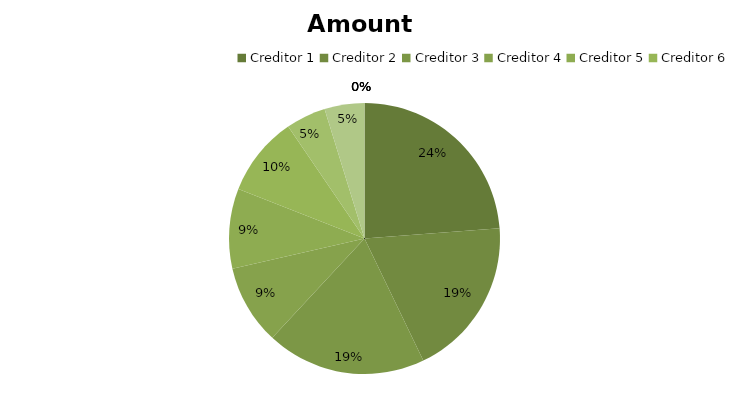
| Category | Amount  Owing |
|---|---|
| Creditor 1 | 1000 |
| Creditor 2 | 800 |
| Creditor 3 | 800 |
| Creditor 4 | 400 |
| Creditor 5 | 400 |
| Creditor 6 | 400 |
| Creditor 7 | 200 |
| Creditor 8 | 200 |